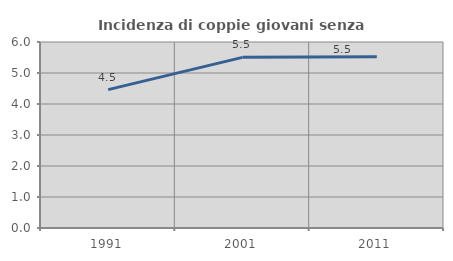
| Category | Incidenza di coppie giovani senza figli |
|---|---|
| 1991.0 | 4.464 |
| 2001.0 | 5.505 |
| 2011.0 | 5.528 |